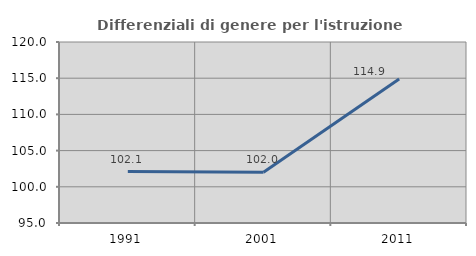
| Category | Differenziali di genere per l'istruzione superiore |
|---|---|
| 1991.0 | 102.113 |
| 2001.0 | 102.005 |
| 2011.0 | 114.9 |